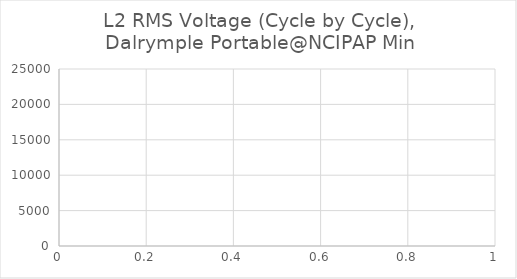
| Category | L2 RMS Voltage (Cycle by Cycle), Dalrymple Portable@NCIPAP Min |
|---|---|
| 0 | 19247.3 |
| 1 | 19247.29 |
| 2 | 19247.26 |
| 3 | 19248.41 |
| 4 | 19249.56 |
| 5 | 19249.56 |
| 6 | 19250.75 |
| 7 | 19251.95 |
| 8 | 19251.97 |
| 9 | 19249.29 |
| 10 | 19246.61 |
| 11 | 19241.32 |
| 12 | 19245.13 |
| 13 | 19248.93 |
| 14 | 19248.98 |
| 15 | 19249 |
| 16 | 19249.03 |
| 17 | 19248.97 |
| 18 | 19248.98 |
| 19 | 19248.98 |
| 20 | 19248.97 |
| 21 | 19248.95 |
| 22 | 19248.95 |
| 23 | 19248.95 |
| 24 | 19248.94 |
| 25 | 19248.99 |
| 26 | 19250.16 |
| 27 | 19251.34 |
| 28 | 19251.31 |
| 29 | 19248.7 |
| 30 | 19246.08 |
| 31 | 19246.09 |
| 32 | 19249.87 |
| 33 | 19253.65 |
| 34 | 19248.38 |
| 35 | 19248.4 |
| 36 | 19248.41 |
| 37 | 19251.36 |
| 38 | 19253.98 |
| 39 | 19256.6 |
| 40 | 19248.94 |
| 41 | 19247.78 |
| 42 | 19246.63 |
| 43 | 19251.95 |
| 44 | 19250.76 |
| 45 | 19249.58 |
| 46 | 19249.6 |
| 47 | 19249.63 |
| 48 | 19249.6 |
| 49 | 19248.44 |
| 50 | 19247.28 |
| 51 | 19254.91 |
| 52 | 19252.24 |
| 53 | 19249.57 |
| 54 | 19249.54 |
| 55 | 19250.72 |
| 56 | 19251.9 |
| 57 | 19252 |
| 58 | 19252 |
| 59 | 19252 |
| 60 | 19251.97 |
| 61 | 19251.92 |
| 62 | 19251.87 |
| 63 | 19246.61 |
| 64 | 19247.77 |
| 65 | 19248.94 |
| 66 | 19248.94 |
| 67 | 19248.96 |
| 68 | 19248.97 |
| 69 | 19251.39 |
| 70 | 19251.38 |
| 71 | 19251.37 |
| 72 | 19251.35 |
| 73 | 19251.34 |
| 74 | 19251.31 |
| 75 | 19252.48 |
| 76 | 19253.64 |
| 77 | 19253.65 |
| 78 | 19253.66 |
| 79 | 19253.66 |
| 80 | 19253.71 |
| 81 | 19253.72 |
| 82 | 19253.74 |
| 83 | 19253.72 |
| 84 | 19253.68 |
| 85 | 19253.65 |
| 86 | 19253.65 |
| 87 | 19251.02 |
| 88 | 19248.38 |
| 89 | 19248.38 |
| 90 | 19249.59 |
| 91 | 19250.8 |
| 92 | 19250.79 |
| 93 | 19250.79 |
| 94 | 19250.79 |
| 95 | 19250.77 |
| 96 | 19250.77 |
| 97 | 19250.78 |
| 98 | 19248.11 |
| 99 | 19245.45 |
| 100 | 19250.77 |
| 101 | 19250.77 |
| 102 | 19250.76 |
| 103 | 19250.79 |
| 104 | 19250.79 |
| 105 | 19250.8 |
| 106 | 19250.77 |
| 107 | 19250.77 |
| 108 | 19250.77 |
| 109 | 19250.78 |
| 110 | 19250.78 |
| 111 | 19245.47 |
| 112 | 19247.88 |
| 113 | 19249.11 |
| 114 | 19250.33 |
| 115 | 19252.73 |
| 116 | 19250.1 |
| 117 | 19247.47 |
| 118 | 19244.63 |
| 119 | 19245.83 |
| 120 | 19247.03 |
| 121 | 19249.48 |
| 122 | 19248.1 |
| 123 | 19246.73 |
| 124 | 19247.98 |
| 125 | 19249.23 |
| 126 | 19251.68 |
| 127 | 19249.06 |
| 128 | 19246.44 |
| 129 | 19248.93 |
| 130 | 19246.34 |
| 131 | 19243.75 |
| 132 | 19246.25 |
| 133 | 19246.26 |
| 134 | 19246.27 |
| 135 | 19248.81 |
| 136 | 19248.77 |
| 137 | 19248.74 |
| 138 | 19246.05 |
| 139 | 19247.3 |
| 140 | 19248.56 |
| 141 | 19251.15 |
| 142 | 19248.6 |
| 143 | 19246.05 |
| 144 | 19246.06 |
| 145 | 19246.04 |
| 146 | 19246.01 |
| 147 | 19248.52 |
| 148 | 19248.53 |
| 149 | 19248.53 |
| 150 | 19249.82 |
| 151 | 19251.11 |
| 152 | 19245.95 |
| 153 | 19245.98 |
| 154 | 19246 |
| 155 | 19240.78 |
| 156 | 19248.49 |
| 157 | 19248.49 |
| 158 | 19248.49 |
| 159 | 19251.08 |
| 160 | 19253.66 |
| 161 | 19245.95 |
| 162 | 19245.97 |
| 163 | 19245.98 |
| 164 | 19245.94 |
| 165 | 19245.93 |
| 166 | 19245.92 |
| 167 | 19245.91 |
| 168 | 19247.21 |
| 169 | 19248.5 |
| 170 | 19243.35 |
| 171 | 19244.68 |
| 172 | 19246 |
| 173 | 19248.61 |
| 174 | 19248.61 |
| 175 | 19248.6 |
| 176 | 19249.88 |
| 177 | 19251.16 |
| 178 | 19246.01 |
| 179 | 19247.34 |
| 180 | 19248.67 |
| 181 | 19243.55 |
| 182 | 19247.43 |
| 183 | 19251.32 |
| 184 | 19246.24 |
| 185 | 19243.67 |
| 186 | 19241.1 |
| 187 | 19248.79 |
| 188 | 19246.23 |
| 189 | 19243.67 |
| 190 | 19243.7 |
| 191 | 19243.69 |
| 192 | 19243.69 |
| 193 | 19246.39 |
| 194 | 19246.41 |
| 195 | 19246.43 |
| 196 | 19246.46 |
| 197 | 19245.07 |
| 198 | 19243.68 |
| 199 | 19238.52 |
| 200 | 19242.44 |
| 201 | 19246.37 |
| 202 | 19246.41 |
| 203 | 19246.45 |
| 204 | 19246.43 |
| 205 | 19246.4 |
| 206 | 19246.38 |
| 207 | 19238.64 |
| 208 | 19245.07 |
| 209 | 19251.49 |
| 210 | 19251.42 |
| 211 | 19248.88 |
| 212 | 19246.34 |
| 213 | 19246.37 |
| 214 | 19248.93 |
| 215 | 19251.5 |
| 216 | 19243.77 |
| 217 | 19243.77 |
| 218 | 19243.75 |
| 219 | 19251.44 |
| 220 | 19248.87 |
| 221 | 19246.29 |
| 222 | 19246.37 |
| 223 | 19247.74 |
| 224 | 19249.11 |
| 225 | 19243.99 |
| 226 | 19243.97 |
| 227 | 19243.95 |
| 228 | 19245.29 |
| 229 | 19246.62 |
| 230 | 19249.27 |
| 231 | 19249.26 |
| 232 | 19249.25 |
| 233 | 19252.02 |
| 234 | 19249.5 |
| 235 | 19246.97 |
| 236 | 19254.75 |
| 237 | 19252.22 |
| 238 | 19249.69 |
| 239 | 19249.67 |
| 240 | 19249.67 |
| 241 | 19249.66 |
| 242 | 19249.61 |
| 243 | 19249.64 |
| 244 | 19249.67 |
| 245 | 19249.65 |
| 246 | 19245.72 |
| 247 | 19241.79 |
| 248 | 19241.83 |
| 249 | 19245.77 |
| 250 | 19249.71 |
| 251 | 19249.72 |
| 252 | 19249.71 |
| 253 | 19249.7 |
| 254 | 19249.66 |
| 255 | 19249.62 |
| 256 | 19244.55 |
| 257 | 19244.55 |
| 258 | 19244.54 |
| 259 | 19252.35 |
| 260 | 19252.36 |
| 261 | 19252.38 |
| 262 | 19252.37 |
| 263 | 19252.38 |
| 264 | 19252.38 |
| 265 | 19244.58 |
| 266 | 19247.1 |
| 267 | 19249.62 |
| 268 | 19249.6 |
| 269 | 19249.63 |
| 270 | 19249.66 |
| 271 | 19252.03 |
| 272 | 19252.01 |
| 273 | 19251.99 |
| 274 | 19249.3 |
| 275 | 19249.35 |
| 276 | 19249.39 |
| 277 | 19246.71 |
| 278 | 19246.71 |
| 279 | 19246.59 |
| 280 | 19246.57 |
| 281 | 19246.54 |
| 282 | 19249.31 |
| 283 | 19249.3 |
| 284 | 19249.29 |
| 285 | 19252.01 |
| 286 | 19249.48 |
| 287 | 19246.96 |
| 288 | 19249.74 |
| 289 | 19249.7 |
| 290 | 19249.65 |
| 291 | 19249.62 |
| 292 | 19247.09 |
| 293 | 19244.55 |
| 294 | 19252.36 |
| 295 | 19249.85 |
| 296 | 19247.34 |
| 297 | 19247.36 |
| 298 | 19244.83 |
| 299 | 19242.29 |
| 300 | 19250.02 |
| 301 | 19250.02 |
| 302 | 19250.03 |
| 303 | 19247.51 |
| 304 | 19245 |
| 305 | 19244.97 |
| 306 | 19246.35 |
| 307 | 19247.73 |
| 308 | 19247.79 |
| 309 | 19250.55 |
| 310 | 19250.55 |
| 311 | 19250.45 |
| 312 | 19250.45 |
| 313 | 19250.44 |
| 314 | 19242.67 |
| 315 | 19245.21 |
| 316 | 19247.76 |
| 317 | 19247.79 |
| 318 | 19247.79 |
| 319 | 19247.79 |
| 320 | 19244.99 |
| 321 | 19244.98 |
| 322 | 19244.97 |
| 323 | 19250.02 |
| 324 | 19250.02 |
| 325 | 19242.17 |
| 326 | 19255.1 |
| 327 | 19252.6 |
| 328 | 19250.1 |
| 329 | 19252.59 |
| 330 | 19255.09 |
| 331 | 19249.99 |
| 332 | 19247.49 |
| 333 | 19244.99 |
| 334 | 19247.79 |
| 335 | 19247.79 |
| 336 | 19247.79 |
| 337 | 19250.51 |
| 338 | 19247.98 |
| 339 | 19245.45 |
| 340 | 19245.42 |
| 341 | 19245.43 |
| 342 | 19245.43 |
| 343 | 19245.45 |
| 344 | 19245.46 |
| 345 | 19245.46 |
| 346 | 19245.47 |
| 347 | 19245.46 |
| 348 | 19245.44 |
| 349 | 19250.5 |
| 350 | 19250.48 |
| 351 | 19250.46 |
| 352 | 19250.43 |
| 353 | 19250.46 |
| 354 | 19250.49 |
| 355 | 19249.14 |
| 356 | 19247.79 |
| 357 | 19242.71 |
| 358 | 19246.6 |
| 359 | 19250.49 |
| 360 | 19250.46 |
| 361 | 19250.46 |
| 362 | 19250.46 |
| 363 | 19250.49 |
| 364 | 19246.57 |
| 365 | 19242.66 |
| 366 | 19247.75 |
| 367 | 19246.37 |
| 368 | 19244.99 |
| 369 | 19250.05 |
| 370 | 19248.68 |
| 371 | 19247.31 |
| 372 | 19252.4 |
| 373 | 19251 |
| 374 | 19249.6 |
| 375 | 19254.68 |
| 376 | 19253.37 |
| 377 | 19252.05 |
| 378 | 19249.37 |
| 379 | 19248.01 |
| 380 | 19246.65 |
| 381 | 19249.19 |
| 382 | 19251.72 |
| 383 | 19243.88 |
| 384 | 19245.11 |
| 385 | 19246.34 |
| 386 | 19251.43 |
| 387 | 19251.43 |
| 388 | 19251.43 |
| 389 | 19254.13 |
| 390 | 19251.57 |
| 391 | 19249.01 |
| 392 | 19249.04 |
| 393 | 19249.07 |
| 394 | 19249.09 |
| 395 | 19249.06 |
| 396 | 19246.47 |
| 397 | 19243.89 |
| 398 | 19251.72 |
| 399 | 19251.73 |
| 400 | 19251.74 |
| 401 | 19246.66 |
| 402 | 19249.21 |
| 403 | 19251.75 |
| 404 | 19251.72 |
| 405 | 19251.7 |
| 406 | 19251.68 |
| 407 | 19251.66 |
| 408 | 19251.64 |
| 409 | 19251.65 |
| 410 | 19250.34 |
| 411 | 19249.03 |
| 412 | 19249.08 |
| 413 | 19251.64 |
| 414 | 19254.2 |
| 415 | 19251.52 |
| 416 | 19251.5 |
| 417 | 19251.48 |
| 418 | 19246.33 |
| 419 | 19246.34 |
| 420 | 19246.35 |
| 421 | 19249 |
| 422 | 19246.46 |
| 423 | 19243.91 |
| 424 | 19251.7 |
| 425 | 19249.15 |
| 426 | 19246.6 |
| 427 | 19249.34 |
| 428 | 19249.35 |
| 429 | 19249.36 |
| 430 | 19249.35 |
| 431 | 19250.68 |
| 432 | 19252.01 |
| 433 | 19251.99 |
| 434 | 19251.98 |
| 435 | 19246.9 |
| 436 | 19250.79 |
| 437 | 19254.67 |
| 438 | 19249.63 |
| 439 | 19249.65 |
| 440 | 19249.67 |
| 441 | 19252.42 |
| 442 | 19252.42 |
| 443 | 19252.42 |
| 444 | 19255.1 |
| 445 | 19252.54 |
| 446 | 19249.98 |
| 447 | 19244.91 |
| 448 | 19246.32 |
| 449 | 19247.74 |
| 450 | 19247.8 |
| 451 | 19249.17 |
| 452 | 19250.54 |
| 453 | 19250.49 |
| 454 | 19247.95 |
| 455 | 19245.42 |
| 456 | 19253.2 |
| 457 | 19250.71 |
| 458 | 19248.22 |
| 459 | 19248.24 |
| 460 | 19248.27 |
| 461 | 19251.06 |
| 462 | 19248.53 |
| 463 | 19245.99 |
| 464 | 19253.76 |
| 465 | 19251.22 |
| 466 | 19248.68 |
| 467 | 19251.51 |
| 468 | 19251.54 |
| 469 | 19251.58 |
| 470 | 19254.44 |
| 471 | 19251.95 |
| 472 | 19249.46 |
| 473 | 19249.41 |
| 474 | 19246.85 |
| 475 | 19244.29 |
| 476 | 19252.12 |
| 477 | 19249.67 |
| 478 | 19247.22 |
| 479 | 19250.08 |
| 480 | 19250.08 |
| 481 | 19250.08 |
| 482 | 19252.94 |
| 483 | 19252.9 |
| 484 | 19252.86 |
| 485 | 19247.83 |
| 486 | 19249.25 |
| 487 | 19250.67 |
| 488 | 19248.23 |
| 489 | 19245.79 |
| 490 | 19253.71 |
| 491 | 19253.69 |
| 492 | 19253.67 |
| 493 | 19248.62 |
| 494 | 19248.6 |
| 495 | 19248.58 |
| 496 | 19251.51 |
| 497 | 19249.04 |
| 498 | 19246.58 |
| 499 | 19257.4 |
| 500 | 19254.91 |
| 501 | 19252.42 |
| 502 | 19247.43 |
| 503 | 19248.87 |
| 504 | 19250.31 |
| 505 | 19253.21 |
| 506 | 19250.78 |
| 507 | 19248.35 |
| 508 | 19248.32 |
| 509 | 19248.32 |
| 510 | 19248.33 |
| 511 | 19256.22 |
| 512 | 19252.28 |
| 513 | 19248.33 |
| 514 | 19249.79 |
| 515 | 19251.25 |
| 516 | 19251.24 |
| 517 | 19251.25 |
| 518 | 19251.26 |
| 519 | 19251.26 |
| 520 | 19250.27 |
| 521 | 19249.28 |
| 522 | 19249.3 |
| 523 | 19248.33 |
| 524 | 19247.37 |
| 525 | 19250.4 |
| 526 | 19251.89 |
| 527 | 19253.37 |
| 528 | 19251.41 |
| 529 | 19248.95 |
| 530 | 19246.48 |
| 531 | 19254.38 |
| 532 | 19251.92 |
| 533 | 19249.46 |
| 534 | 19244.6 |
| 535 | 19248.59 |
| 536 | 19252.57 |
| 537 | 19252.62 |
| 538 | 19250.17 |
| 539 | 19247.72 |
| 540 | 19246.18 |
| 541 | 19244.65 |
| 542 | 19249.52 |
| 543 | 19249.51 |
| 544 | 19249.5 |
| 545 | 19249.49 |
| 546 | 19249.49 |
| 547 | 19249.49 |
| 548 | 19249.51 |
| 549 | 19249.53 |
| 550 | 19249.54 |
| 551 | 19249.5 |
| 552 | 19247.06 |
| 553 | 19244.62 |
| 554 | 19244.63 |
| 555 | 19244.65 |
| 556 | 19244.67 |
| 557 | 19244.64 |
| 558 | 19246.14 |
| 559 | 19247.65 |
| 560 | 19247.59 |
| 561 | 19249.14 |
| 562 | 19250.69 |
| 563 | 19250.7 |
| 564 | 19250.73 |
| 565 | 19250.75 |
| 566 | 19250.74 |
| 567 | 19250.73 |
| 568 | 19245.84 |
| 569 | 19245.84 |
| 570 | 19245.85 |
| 571 | 19248.87 |
| 572 | 19250.38 |
| 573 | 19251.89 |
| 574 | 19254.99 |
| 575 | 19251.03 |
| 576 | 19247.08 |
| 577 | 19250.17 |
| 578 | 19247.72 |
| 579 | 19245.27 |
| 580 | 19245.29 |
| 581 | 19249.26 |
| 582 | 19253.23 |
| 583 | 19253.2 |
| 584 | 19249.26 |
| 585 | 19245.31 |
| 586 | 19248.41 |
| 587 | 19246.84 |
| 588 | 19245.28 |
| 589 | 19253.21 |
| 590 | 19250.8 |
| 591 | 19248.39 |
| 592 | 19248.41 |
| 593 | 19248.43 |
| 594 | 19253.23 |
| 595 | 19249.24 |
| 596 | 19245.26 |
| 597 | 19250.15 |
| 598 | 19250.16 |
| 599 | 19250.18 |
| 600 | 19247.16 |
| 601 | 19247.14 |
| 602 | 19247.13 |
| 603 | 19243.99 |
| 604 | 19243.97 |
| 605 | 19243.96 |
| 606 | 19248.86 |
| 607 | 19247.33 |
| 608 | 19245.8 |
| 609 | 19245.84 |
| 610 | 19248.3 |
| 611 | 19250.76 |
| 612 | 19250.78 |
| 613 | 19249.24 |
| 614 | 19247.7 |
| 615 | 19244.6 |
| 616 | 19247.02 |
| 617 | 19249.44 |
| 618 | 19249.46 |
| 619 | 19249.47 |
| 620 | 19249.55 |
| 621 | 19248.04 |
| 622 | 19246.52 |
| 623 | 19251.47 |
| 624 | 19249.97 |
| 625 | 19248.47 |
| 626 | 19245.41 |
| 627 | 19247.86 |
| 628 | 19250.3 |
| 629 | 19242.38 |
| 630 | 19242.38 |
| 631 | 19252.22 |
| 632 | 19252.24 |
| 633 | 19252.25 |
| 634 | 19252.26 |
| 635 | 19247.41 |
| 636 | 19247.4 |
| 637 | 19247.39 |
| 638 | 19242.4 |
| 639 | 19246.33 |
| 640 | 19250.27 |
| 641 | 19250.28 |
| 642 | 19250.28 |
| 643 | 19250.28 |
| 644 | 19250.27 |
| 645 | 19250.27 |
| 646 | 19250.35 |
| 647 | 19250.36 |
| 648 | 19250.38 |
| 649 | 19250.39 |
| 650 | 19251.87 |
| 651 | 19253.35 |
| 652 | 19248.37 |
| 653 | 19245.9 |
| 654 | 19243.43 |
| 655 | 19246.48 |
| 656 | 19248.03 |
| 657 | 19249.57 |
| 658 | 19252.61 |
| 659 | 19251.69 |
| 660 | 19250.76 |
| 661 | 19253.76 |
| 662 | 19252.82 |
| 663 | 19251.89 |
| 664 | 19253.2 |
| 665 | 19252.36 |
| 666 | 19251.51 |
| 667 | 19245.03 |
| 668 | 19248.13 |
| 669 | 19251.23 |
| 670 | 17440.93 |
| 671 | 15630.62 |
| 672 | 15752.6 |
| 673 | 16280.07 |
| 674 | 16807.53 |
| 675 | 18601.98 |
| 676 | 18664.08 |
| 677 | 18726.18 |
| 678 | 18837.95 |
| 679 | 18876.25 |
| 680 | 18914.55 |
| 681 | 18977.88 |
| 682 | 19001.66 |
| 683 | 19025.45 |
| 684 | 19062.21 |
| 685 | 19077.06 |
| 686 | 19091.91 |
| 687 | 19118.27 |
| 688 | 19127.02 |
| 689 | 19135.77 |
| 690 | 19155.75 |
| 691 | 19155.75 |
| 692 | 19174.73 |
| 693 | 19196.18 |
| 694 | 19199.34 |
| 695 | 19202.49 |
| 696 | 19210.53 |
| 697 | 19218.58 |
| 698 | 19235.09 |
| 699 | 19236.79 |
| 700 | 19238.5 |
| 701 | 19246.22 |
| 702 | 19246.96 |
| 703 | 19247.71 |
| 704 | 19251.69 |
| 705 | 19249.65 |
| 706 | 19247.61 |
| 707 | 19257.62 |
| 708 | 19253.55 |
| 709 | 19249.49 |
| 710 | 19250.67 |
| 711 | 19249.57 |
| 712 | 19248.47 |
| 713 | 19246.31 |
| 714 | 19241.31 |
| 715 | 19236.32 |
| 716 | 19239.18 |
| 717 | 19239.87 |
| 718 | 19240.55 |
| 719 | 19232.47 |
| 720 | 19232.43 |
| 721 | 19232.39 |
| 722 | 19226.18 |
| 723 | 19228.77 |
| 724 | 19231.36 |
| 725 | 19229.32 |
| 726 | 19227.29 |
| 727 | 19231.46 |
| 728 | 19231.33 |
| 729 | 19231.2 |
| 730 | 19234.8 |
| 731 | 19233.26 |
| 732 | 19231.72 |
| 733 | 19233.35 |
| 734 | 19238.71 |
| 735 | 19244.08 |
| 736 | 19247.68 |
| 737 | 19245.43 |
| 738 | 19243.19 |
| 739 | 19244.11 |
| 740 | 19245.02 |
| 741 | 19245.94 |
| 742 | 19243.32 |
| 743 | 19246.13 |
| 744 | 19248.93 |
| 745 | 19240.78 |
| 746 | 19242.57 |
| 747 | 19244.37 |
| 748 | 19238.75 |
| 749 | 19241.85 |
| 750 | 19244.95 |
| 751 | 19248.13 |
| 752 | 19251.29 |
| 753 | 19254.13 |
| 754 | 19253.31 |
| 755 | 19252.48 |
| 756 | 19251.69 |
| 757 | 19253.49 |
| 758 | 19255.3 |
| 759 | 19255.32 |
| 760 | 19259.8 |
| 761 | 19264.28 |
| 762 | 19256.97 |
| 763 | 19257.4 |
| 764 | 19257.82 |
| 765 | 19254.06 |
| 766 | 19256.35 |
| 767 | 19258.64 |
| 768 | 19254.12 |
| 769 | 19254.08 |
| 770 | 19254.04 |
| 771 | 19253.99 |
| 772 | 19255.87 |
| 773 | 19257.75 |
| 774 | 19249.63 |
| 775 | 19251.88 |
| 776 | 19254.12 |
| 777 | 19252.26 |
| 778 | 19250.4 |
| 779 | 19259.41 |
| 780 | 19259.86 |
| 781 | 19260.31 |
| 782 | 19261.21 |
| 783 | 19261.69 |
| 784 | 19262.17 |
| 785 | 19258.63 |
| 786 | 19262.67 |
| 787 | 19266.71 |
| 788 | 19262.13 |
| 789 | 19263.94 |
| 790 | 19265.74 |
| 791 | 19256.69 |
| 792 | 19258.48 |
| 793 | 19260.28 |
| 794 | 19255.77 |
| 795 | 19258.08 |
| 796 | 19260.38 |
| 797 | 19264.93 |
| 798 | 19264.93 |
| 799 | 19265.76 |
| 800 | 19262.02 |
| 801 | 19262.05 |
| 802 | 19262.09 |
| 803 | 19264.43 |
| 804 | 19266.77 |
| 805 | 19266.85 |
| 806 | 19266.3 |
| 807 | 19265.76 |
| 808 | 19264.78 |
| 809 | 19266.13 |
| 810 | 19267.49 |
| 811 | 19265.82 |
| 812 | 19267.26 |
| 813 | 19268.71 |
| 814 | 19267.93 |
| 815 | 19267.56 |
| 816 | 19267.19 |
| 817 | 19266.42 |
| 818 | 19264.21 |
| 819 | 19262.01 |
| 820 | 19261.94 |
| 821 | 19261.95 |
| 822 | 19261.95 |
| 823 | 19261.91 |
| 824 | 19261.95 |
| 825 | 19261.99 |
| 826 | 19265.83 |
| 827 | 19265.44 |
| 828 | 19265.05 |
| 829 | 19268.07 |
| 830 | 19268.07 |
| 831 | 19258.7 |
| 832 | 19262.2 |
| 833 | 19265.71 |
| 834 | 19264.63 |
| 835 | 19268.31 |
| 836 | 19271.98 |
| 837 | 19267.22 |
| 838 | 19266.98 |
| 839 | 19266.74 |
| 840 | 19266.3 |
| 841 | 19268.26 |
| 842 | 19270.23 |
| 843 | 19266.01 |
| 844 | 19266.03 |
| 845 | 19266.04 |
| 846 | 19270.35 |
| 847 | 19270.5 |
| 848 | 19270.66 |
| 849 | 19266.64 |
| 850 | 19266.65 |
| 851 | 19266.66 |
| 852 | 19271.08 |
| 853 | 19271.11 |
| 854 | 19271.15 |
| 855 | 19269 |
| 856 | 19266.85 |
| 857 | 19274.98 |
| 858 | 19272.77 |
| 859 | 19270.56 |
| 860 | 19274.46 |
| 861 | 19274.5 |
| 862 | 19274.54 |
| 863 | 19278.58 |
| 864 | 19278.6 |
| 865 | 19278.61 |
| 866 | 19278.63 |
| 867 | 19276.41 |
| 868 | 19274.19 |
| 869 | 19274.13 |
| 870 | 19278.26 |
| 871 | 19282.38 |
| 872 | 19274.22 |
| 873 | 19274.23 |
| 874 | 19274.24 |
| 875 | 19274.25 |
| 876 | 19276.41 |
| 877 | 19278.57 |
| 878 | 19274.23 |
| 879 | 19278.34 |
| 880 | 19282.44 |
| 881 | 19282.41 |
| 882 | 19280.29 |
| 883 | 19278.16 |
| 884 | 19282.27 |
| 885 | 19286.37 |
| 886 | 19277.81 |
| 887 | 19279.81 |
| 888 | 19281.8 |
| 889 | 19281.51 |
| 890 | 19279.37 |
| 891 | 19277.23 |
| 892 | 19281.23 |
| 893 | 19281.13 |
| 894 | 19281.02 |
| 895 | 19285.04 |
| 896 | 19282.89 |
| 897 | 19280.74 |
| 898 | 19284.77 |
| 899 | 19284.77 |
| 900 | 19284.76 |
| 901 | 19284.81 |
| 902 | 19286.86 |
| 903 | 19288.91 |
| 904 | 19284.7 |
| 905 | 19284.57 |
| 906 | 19284.44 |
| 907 | 19292.57 |
| 908 | 19290.39 |
| 909 | 19288.22 |
| 910 | 19290.21 |
| 911 | 19292.2 |
| 912 | 19292.26 |
| 913 | 19290.24 |
| 914 | 19288.21 |
| 915 | 19288.22 |
| 916 | 19288.2 |
| 917 | 19288.19 |
| 918 | 19292.27 |
| 919 | 19290.17 |
| 920 | 19288.08 |
| 921 | 19292.34 |
| 922 | 19294.46 |
| 923 | 19296.57 |
| 924 | 19292.38 |
| 925 | 19292.39 |
| 926 | 19292.39 |
| 927 | 19292.33 |
| 928 | 19290.23 |
| 929 | 19288.13 |
| 930 | 19288.21 |
| 931 | 19288.31 |
| 932 | 19288.4 |
| 933 | 19288.59 |
| 934 | 19288.72 |
| 935 | 19288.84 |
| 936 | 19286.76 |
| 937 | 19284.69 |
| 938 | 19292.93 |
| 939 | 19288.73 |
| 940 | 19284.54 |
| 941 | 19284.54 |
| 942 | 19288.66 |
| 943 | 19292.78 |
| 944 | 19292.69 |
| 945 | 19290.58 |
| 946 | 19288.47 |
| 947 | 19296.57 |
| 948 | 19292.4 |
| 949 | 19288.22 |
| 950 | 19296.63 |
| 951 | 19298.76 |
| 952 | 19300.89 |
| 953 | 19292.7 |
| 954 | 19292.75 |
| 955 | 19292.8 |
| 956 | 19292.95 |
| 957 | 19295.08 |
| 958 | 19297.2 |
| 959 | 19297.41 |
| 960 | 19297.45 |
| 961 | 19297.48 |
| 962 | 19297.49 |
| 963 | 19297.5 |
| 964 | 19293.28 |
| 965 | 19293.12 |
| 966 | 19292.96 |
| 967 | 19301.07 |
| 968 | 19296.82 |
| 969 | 19292.56 |
| 970 | 19300.7 |
| 971 | 19298.57 |
| 972 | 19296.45 |
| 973 | 19296.45 |
| 974 | 19296.44 |
| 975 | 19296.44 |
| 976 | 19304.73 |
| 977 | 19302.63 |
| 978 | 19300.53 |
| 979 | 19300.5 |
| 980 | 19298.45 |
| 981 | 19296.39 |
| 982 | 19296.44 |
| 983 | 19298.52 |
| 984 | 19300.61 |
| 985 | 19300.63 |
| 986 | 19302.76 |
| 987 | 19304.88 |
| 988 | 19302.82 |
| 989 | 19300.77 |
| 990 | 19300.81 |
| 991 | 19298.75 |
| 992 | 19296.7 |
| 993 | 19300.95 |
| 994 | 19303 |
| 995 | 19305.05 |
| 996 | 19305.04 |
| 997 | 19305.02 |
| 998 | 19304.99 |
| 999 | 19309.13 |
| 1000 | 19307.04 |
| 1001 | 19304.95 |
| 1002 | 19304.89 |
| 1003 | 19302.83 |
| 1004 | 19300.77 |
| 1005 | 19313.14 |
| 1006 | 19311.03 |
| 1007 | 19308.91 |
| 1008 | 19304.68 |
| 1009 | 19304.66 |
| 1010 | 19304.65 |
| 1011 | 19308.85 |
| 1012 | 19306.8 |
| 1013 | 19304.74 |
| 1014 | 19306.79 |
| 1015 | 19308.84 |
| 1016 | 19308.86 |
| 1017 | 19308.82 |
| 1018 | 19308.78 |
| 1019 | 19304.69 |
| 1020 | 19306.79 |
| 1021 | 19308.88 |
| 1022 | 19308.92 |
| 1023 | 19311.03 |
| 1024 | 19313.13 |
| 1025 | 19313.16 |
| 1026 | 19315.27 |
| 1027 | 19317.38 |
| 1028 | 19309.14 |
| 1029 | 19309.23 |
| 1030 | 19309.33 |
| 1031 | 19309.53 |
| 1032 | 19309.63 |
| 1033 | 19309.72 |
| 1034 | 19314 |
| 1035 | 19314.06 |
| 1036 | 19314.12 |
| 1037 | 19310.29 |
| 1038 | 19310.44 |
| 1039 | 19310.59 |
| 1040 | 19314.94 |
| 1041 | 19319.28 |
| 1042 | 19311.25 |
| 1043 | 19311.67 |
| 1044 | 19311.67 |
| 1045 | 19311.64 |
| 1046 | 19311.61 |
| 1047 | 19311.57 |
| 1048 | 19311.5 |
| 1049 | 19313.7 |
| 1050 | 19315.9 |
| 1051 | 19311.55 |
| 1052 | 19313.76 |
| 1053 | 19315.96 |
| 1054 | 19315.99 |
| 1055 | 19313.97 |
| 1056 | 19311.94 |
| 1057 | 19316.32 |
| 1058 | 19318.47 |
| 1059 | 19320.63 |
| 1060 | 19316.71 |
| 1061 | 19316.98 |
| 1062 | 19317.24 |
| 1063 | 19309.22 |
| 1064 | 19311.44 |
| 1065 | 19313.66 |
| 1066 | 19311.61 |
| 1067 | 19309.56 |
| 1068 | 19309.99 |
| 1069 | 19312.23 |
| 1070 | 19314.48 |
| 1071 | 19319.02 |
| 1072 | 19317.09 |
| 1073 | 19315.16 |
| 1074 | 19311.21 |
| 1075 | 19313.44 |
| 1076 | 19315.67 |
| 1077 | 19315.54 |
| 1078 | 19313.57 |
| 1079 | 19311.6 |
| 1080 | 19307.74 |
| 1081 | 19311.95 |
| 1082 | 19316.16 |
| 1083 | 19316.26 |
| 1084 | 19316.24 |
| 1085 | 19316.22 |
| 1086 | 19311.63 |
| 1087 | 19311.61 |
| 1088 | 19311.59 |
| 1089 | 19315.52 |
| 1090 | 19315.58 |
| 1091 | 19315.64 |
| 1092 | 19315.67 |
| 1093 | 19315.7 |
| 1094 | 19315.64 |
| 1095 | 19315.38 |
| 1096 | 19315.12 |
| 1097 | 19315.07 |
| 1098 | 19315.05 |
| 1099 | 19315.03 |
| 1100 | 19315.02 |
| 1101 | 19317.01 |
| 1102 | 19319.01 |
| 1103 | 19319.04 |
| 1104 | 19321.03 |
| 1105 | 19323.01 |
| 1106 | 19319.06 |
| 1107 | 19319.06 |
| 1108 | 19319.06 |
| 1109 | 19327.44 |
| 1110 | 19323.23 |
| 1111 | 19319.01 |
| 1112 | 19319.01 |
| 1113 | 19320.98 |
| 1114 | 19322.96 |
| 1115 | 19322.96 |
| 1116 | 19322.96 |
| 1117 | 19322.96 |
| 1118 | 19327.2 |
| 1119 | 19331.43 |
| 1120 | 19322.98 |
| 1121 | 19327.19 |
| 1122 | 19331.39 |
| 1123 | 19322.97 |
| 1124 | 19325.2 |
| 1125 | 19327.43 |
| 1126 | 19327.44 |
| 1127 | 19327.43 |
| 1128 | 19327.43 |
| 1129 | 19327.47 |
| 1130 | 19327.45 |
| 1131 | 19327.43 |
| 1132 | 19326.91 |
| 1133 | 19328.91 |
| 1134 | 19330.91 |
| 1135 | 19326.46 |
| 1136 | 19324.23 |
| 1137 | 19321.99 |
| 1138 | 19317.55 |
| 1139 | 19321.53 |
| 1140 | 19325.51 |
| 1141 | 19321.07 |
| 1142 | 19323.09 |
| 1143 | 19325.1 |
| 1144 | 19327.1 |
| 1145 | 19329.09 |
| 1146 | 19324.73 |
| 1147 | 19326.74 |
| 1148 | 19328.74 |
| 1149 | 19324.37 |
| 1150 | 19324.35 |
| 1151 | 19324.33 |
| 1152 | 19332.73 |
| 1153 | 19330.71 |
| 1154 | 19328.7 |
| 1155 | 19333.08 |
| 1156 | 19331.11 |
| 1157 | 19329.14 |
| 1158 | 19329.1 |
| 1159 | 19329.1 |
| 1160 | 19329.09 |
| 1161 | 19329.05 |
| 1162 | 19331.27 |
| 1163 | 19333.48 |
| 1164 | 19329.49 |
| 1165 | 19331.71 |
| 1166 | 19333.92 |
| 1167 | 19329.99 |
| 1168 | 19332.2 |
| 1169 | 19334.42 |
| 1170 | 19330.46 |
| 1171 | 19330.67 |
| 1172 | 19330.88 |
| 1173 | 19328.88 |
| 1174 | 19326.88 |
| 1175 | 19335.86 |
| 1176 | 19336.12 |
| 1177 | 19336.38 |
| 1178 | 19332.45 |
| 1179 | 19332.73 |
| 1180 | 19333.02 |
| 1181 | 19337.54 |
| 1182 | 19335.57 |
| 1183 | 19333.62 |
| 1184 | 19338.14 |
| 1185 | 19336.21 |
| 1186 | 19334.27 |
| 1187 | 19334.92 |
| 1188 | 19337.18 |
| 1189 | 19339.44 |
| 1190 | 19340.05 |
| 1191 | 19336.17 |
| 1192 | 19332.3 |
| 1193 | 19337.64 |
| 1194 | 19336.11 |
| 1195 | 19334.58 |
| 1196 | 19340.01 |
| 1197 | 19336.16 |
| 1198 | 19332.3 |
| 1199 | 19334.61 |
| 1200 | 19336.92 |
| 1201 | 19329.31 |
| 1202 | 19331.67 |
| 1203 | 19334.04 |
| 1204 | 19338.71 |
| 1205 | 19334.91 |
| 1206 | 19331.11 |
| 1207 | 19335.83 |
| 1208 | 19336.26 |
| 1209 | 19336.7 |
| 1210 | 19337.64 |
| 1211 | 19340.49 |
| 1212 | 19343.35 |
| 1213 | 19335.84 |
| 1214 | 19338.23 |
| 1215 | 19340.61 |
| 1216 | 19336.92 |
| 1217 | 19339.3 |
| 1218 | 19341.68 |
| 1219 | 19337.91 |
| 1220 | 19338.45 |
| 1221 | 19338.98 |
| 1222 | 19343.78 |
| 1223 | 19341.95 |
| 1224 | 19340.11 |
| 1225 | 19342.52 |
| 1226 | 19344.93 |
| 1227 | 19341.22 |
| 1228 | 19339.38 |
| 1229 | 19337.53 |
| 1230 | 19341.15 |
| 1231 | 19341.15 |
| 1232 | 19341.14 |
| 1233 | 19344.88 |
| 1234 | 19344.91 |
| 1235 | 19344.93 |
| 1236 | 19344.93 |
| 1237 | 19342.52 |
| 1238 | 19340.1 |
| 1239 | 19343.82 |
| 1240 | 19343.8 |
| 1241 | 19343.78 |
| 1242 | 19343.78 |
| 1243 | 19341.38 |
| 1244 | 19338.97 |
| 1245 | 19346.43 |
| 1246 | 19342.15 |
| 1247 | 19337.87 |
| 1248 | 19341.64 |
| 1249 | 19341.66 |
| 1250 | 19341.69 |
| 1251 | 19343.55 |
| 1252 | 19345.42 |
| 1253 | 19340.66 |
| 1254 | 19340.64 |
| 1255 | 19340.62 |
| 1256 | 19344.32 |
| 1257 | 19341.96 |
| 1258 | 19339.59 |
| 1259 | 19344.39 |
| 1260 | 19346.78 |
| 1261 | 19349.17 |
| 1262 | 19349.16 |
| 1263 | 19349.14 |
| 1264 | 19349.12 |
| 1265 | 19340.6 |
| 1266 | 19342.99 |
| 1267 | 19345.37 |
| 1268 | 19349.16 |
| 1269 | 19344.91 |
| 1270 | 19340.65 |
| 1271 | 19344.39 |
| 1272 | 19346.25 |
| 1273 | 19348.1 |
| 1274 | 19348.1 |
| 1275 | 19348.13 |
| 1276 | 19348.15 |
| 1277 | 19343.89 |
| 1278 | 19339.63 |
| 1279 | 19339.59 |
| 1280 | 19341.46 |
| 1281 | 19343.32 |
| 1282 | 19347.07 |
| 1283 | 19348.97 |
| 1284 | 19350.88 |
| 1285 | 19342.43 |
| 1286 | 19346.25 |
| 1287 | 19350.06 |
| 1288 | 19345.29 |
| 1289 | 19342.91 |
| 1290 | 19340.54 |
| 1291 | 19348.02 |
| 1292 | 19343.77 |
| 1293 | 19339.52 |
| 1294 | 19343.3 |
| 1295 | 19345.23 |
| 1296 | 19347.16 |
| 1297 | 19347.2 |
| 1298 | 19344.86 |
| 1299 | 19342.52 |
| 1300 | 19346.32 |
| 1301 | 19348.23 |
| 1302 | 19350.13 |
| 1303 | 19345.87 |
| 1304 | 19341.62 |
| 1305 | 19345.43 |
| 1306 | 19345.43 |
| 1307 | 19345.42 |
| 1308 | 19345.47 |
| 1309 | 19345.49 |
| 1310 | 19345.51 |
| 1311 | 19349.31 |
| 1312 | 19349.28 |
| 1313 | 19349.25 |
| 1314 | 19345.38 |
| 1315 | 19347.31 |
| 1316 | 19349.24 |
| 1317 | 19349.3 |
| 1318 | 19349.3 |
| 1319 | 19349.29 |
| 1320 | 19345.47 |
| 1321 | 19347.8 |
| 1322 | 19350.13 |
| 1323 | 19351 |
| 1324 | 19349.1 |
| 1325 | 19347.2 |
| 1326 | 19351.85 |
| 1327 | 19348.04 |
| 1328 | 19344.23 |
| 1329 | 19346.6 |
| 1330 | 19348.98 |
| 1331 | 19353.78 |
| 1332 | 19351.87 |
| 1333 | 19349.96 |
| 1334 | 19342.38 |
| 1335 | 19344.75 |
| 1336 | 19347.11 |
| 1337 | 19348.11 |
| 1338 | 19348.62 |
| 1339 | 19349.12 |
| 1340 | 19350.17 |
| 1341 | 19350.72 |
| 1342 | 19351.27 |
| 1343 | 19352.35 |
| 1344 | 19348.64 |
| 1345 | 19344.93 |
| 1346 | 19346.01 |
| 1347 | 19346.58 |
| 1348 | 19347.15 |
| 1349 | 19348.33 |
| 1350 | 19348.95 |
| 1351 | 19349.57 |
| 1352 | 19350.78 |
| 1353 | 19351.4 |
| 1354 | 19352.01 |
| 1355 | 19352.64 |
| 1356 | 19353.28 |
| 1357 | 19350.89 |
| 1358 | 19349.73 |
| 1359 | 19348.58 |
| 1360 | 19349.9 |
| 1361 | 19348.81 |
| 1362 | 19347.72 |
| 1363 | 19354.25 |
| 1364 | 19352.05 |
| 1365 | 19352.05 |
| 1366 | 19349.9 |
| 1367 | 19350.63 |
| 1368 | 19351.36 |
| 1369 | 19347.77 |
| 1370 | 19350.3 |
| 1371 | 19352.84 |
| 1372 | 19354.43 |
| 1373 | 19352.7 |
| 1374 | 19350.96 |
| 1375 | 19347.49 |
| 1376 | 19349.99 |
| 1377 | 19352.49 |
| 1378 | 19348.94 |
| 1379 | 19347.19 |
| 1380 | 19345.43 |
| 1381 | 19345.44 |
| 1382 | 19345.44 |
| 1383 | 19345.44 |
| 1384 | 19347.19 |
| 1385 | 19348.95 |
| 1386 | 19348.99 |
| 1387 | 19348.99 |
| 1388 | 19348.99 |
| 1389 | 19349 |
| 1390 | 19348.99 |
| 1391 | 19348.99 |
| 1392 | 19348.98 |
| 1393 | 19348.96 |
| 1394 | 19348.95 |
| 1395 | 19352.45 |
| 1396 | 19352.46 |
| 1397 | 19352.46 |
| 1398 | 19352.52 |
| 1399 | 19349.96 |
| 1400 | 19347.41 |
| 1401 | 19350.92 |
| 1402 | 19352.66 |
| 1403 | 19354.41 |
| 1404 | 19354.41 |
| 1405 | 19350.11 |
| 1406 | 19345.8 |
| 1407 | 19350.11 |
| 1408 | 19354.43 |
| 1409 | 19354.51 |
| 1410 | 19354.5 |
| 1411 | 19354.5 |
| 1412 | 19347.36 |
| 1413 | 19346.37 |
| 1414 | 19345.37 |
| 1415 | 19355.67 |
| 1416 | 19353.02 |
| 1417 | 19350.37 |
| 1418 | 19352.09 |
| 1419 | 19352.95 |
| 1420 | 19353.81 |
| 1421 | 19355.49 |
| 1422 | 19352.02 |
| 1423 | 19348.54 |
| 1424 | 19346.82 |
| 1425 | 19347.75 |
| 1426 | 19348.67 |
| 1427 | 19353.99 |
| 1428 | 19354 |
| 1429 | 19354 |
| 1430 | 19353.94 |
| 1431 | 19352.22 |
| 1432 | 19350.49 |
| 1433 | 19348.76 |
| 1434 | 19347.04 |
| 1435 | 19352.27 |
| 1436 | 19350.63 |
| 1437 | 19348.98 |
| 1438 | 19354.32 |
| 1439 | 19355.25 |
| 1440 | 19356.19 |
| 1441 | 19352.75 |
| 1442 | 19351.04 |
| 1443 | 19349.33 |
| 1444 | 19345.91 |
| 1445 | 19349.52 |
| 1446 | 19353.14 |
| 1447 | 19349.88 |
| 1448 | 19352.56 |
| 1449 | 19355.24 |
| 1450 | 19351.93 |
| 1451 | 19350.24 |
| 1452 | 19348.56 |
| 1453 | 19353.85 |
| 1454 | 19367.27 |
| 1455 | 19380.69 |
| 1456 | 19376.01 |
| 1457 | 19362.77 |
| 1458 | 19349.52 |
| 1459 | 19350.97 |
| 1460 | 19352.41 |
| 1461 | 19358.14 |
| 1462 | 19356 |
| 1463 | 19353.87 |
| 1464 | 19355.37 |
| 1465 | 19355.13 |
| 1466 | 19354.89 |
| 1467 | 19354.03 |
| 1468 | 19353.2 |
| 1469 | 19352.38 |
| 1470 | 19354.14 |
| 1471 | 19345.91 |
| 1472 | 19345.91 |
| 1473 | 19336.7 |
| 1474 | 19335.38 |
| 1475 | 19334.07 |
| 1476 | 19331.47 |
| 1477 | 19332.64 |
| 1478 | 19333.82 |
| 1479 | 19331.01 |
| 1480 | 19330.8 |
| 1481 | 19330.6 |
| 1482 | 19331.64 |
| 1483 | 19334.13 |
| 1484 | 19336.63 |
| 1485 | 19340.01 |
| 1486 | 19343.38 |
| 1487 | 19339.84 |
| 1488 | 19336.53 |
| 1489 | 19333.21 |
| 1490 | 19336.96 |
| 1491 | 19337.55 |
| 1492 | 19338.15 |
| 1493 | 19341.1 |
| 1494 | 19337.74 |
| 1495 | 19334.39 |
| 1496 | 19342.22 |
| 1497 | 19340.94 |
| 1498 | 19339.65 |
| 1499 | 19347.34 |
| 1500 | 19341.79 |
| 1501 | 19336.23 |
| 1502 | 19335.21 |
| 1503 | 19341.15 |
| 1504 | 19347.08 |
| 1505 | 19347.11 |
| 1506 | 19344.83 |
| 1507 | 19342.55 |
| 1508 | 19346.57 |
| 1509 | 19350.59 |
| 1510 | 19346.09 |
| 1511 | 19347.9 |
| 1512 | 19349.71 |
| 1513 | 19349.67 |
| 1514 | 19343.36 |
| 1515 | 19337.04 |
| 1516 | 19341.54 |
| 1517 | 19343.81 |
| 1518 | 19346.08 |
| 1519 | 19348.76 |
| 1520 | 19349.67 |
| 1521 | 19350.57 |
| 1522 | 19348.89 |
| 1523 | 19350.34 |
| 1524 | 19351.79 |
| 1525 | 19345.79 |
| 1526 | 19347.28 |
| 1527 | 19348.76 |
| 1528 | 19347.4 |
| 1529 | 19346.48 |
| 1530 | 19345.56 |
| 1531 | 19343.94 |
| 1532 | 19349.29 |
| 1533 | 19354.64 |
| 1534 | 19349.74 |
| 1535 | 19344.83 |
| 1536 | 19343.6 |
| 1537 | 19347.3 |
| 1538 | 19351 |
| 1539 | 19346.38 |
| 1540 | 19350.47 |
| 1541 | 19354.56 |
| 1542 | 19346.24 |
| 1543 | 19348.38 |
| 1544 | 19350.52 |
| 1545 | 19350.61 |
| 1546 | 19348.61 |
| 1547 | 19346.61 |
| 1548 | 19350.88 |
| 1549 | 19348.75 |
| 1550 | 19346.62 |
| 1551 | 19342.28 |
| 1552 | 19346.4 |
| 1553 | 19350.52 |
| 1554 | 19342.16 |
| 1555 | 19342.16 |
| 1556 | 19342.16 |
| 1557 | 19346.4 |
| 1558 | 19344.35 |
| 1559 | 19342.29 |
| 1560 | 19342.32 |
| 1561 | 19342.35 |
| 1562 | 19342.38 |
| 1563 | 19342.41 |
| 1564 | 19342.43 |
| 1565 | 19342.23 |
| 1566 | 19344.29 |
| 1567 | 19346.35 |
| 1568 | 19342.09 |